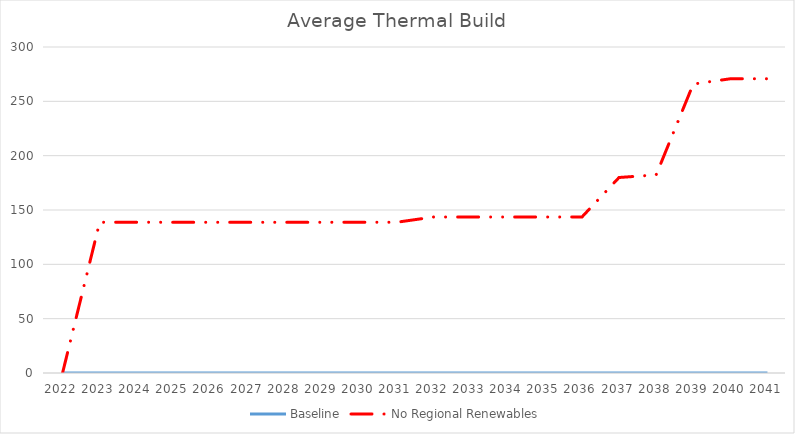
| Category | Baseline | No Regional Renewables |
|---|---|---|
| 2022.0 | 0 | 0 |
| 2023.0 | 0 | 138.7 |
| 2024.0 | 0 | 138.7 |
| 2025.0 | 0 | 138.7 |
| 2026.0 | 0 | 138.7 |
| 2027.0 | 0 | 138.7 |
| 2028.0 | 0 | 138.7 |
| 2029.0 | 0 | 138.7 |
| 2030.0 | 0 | 138.7 |
| 2031.0 | 0 | 138.7 |
| 2032.0 | 0 | 143.567 |
| 2033.0 | 0 | 143.567 |
| 2034.0 | 0 | 143.567 |
| 2035.0 | 0 | 143.567 |
| 2036.0 | 0 | 143.567 |
| 2037.0 | 0 | 179.9 |
| 2038.0 | 0 | 182.333 |
| 2039.0 | 0 | 265.9 |
| 2040.0 | 0 | 270.767 |
| 2041.0 | 0 | 270.767 |